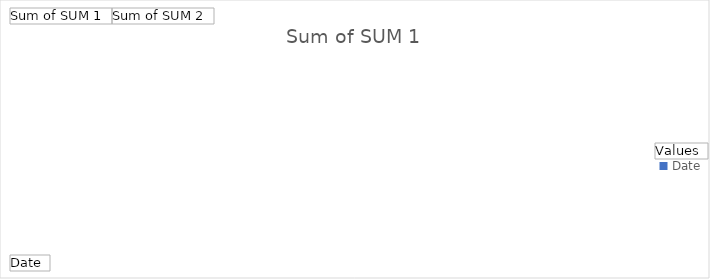
| Category | Sum of SUM 1 | Sum of SUM 2 |
|---|---|---|
| Date | 0 | 0 |